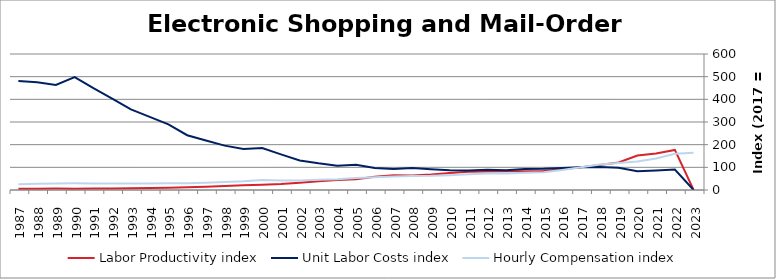
| Category | Labor Productivity index | Unit Labor Costs index | Hourly Compensation index |
|---|---|---|---|
| 2023.0 | 0 | 0 | 163.958 |
| 2022.0 | 176.887 | 90.395 | 159.896 |
| 2021.0 | 161.102 | 86.201 | 138.871 |
| 2020.0 | 152.267 | 82.836 | 126.132 |
| 2019.0 | 121.245 | 98.071 | 118.906 |
| 2018.0 | 110.797 | 101.133 | 112.052 |
| 2017.0 | 100 | 100 | 100 |
| 2016.0 | 91.362 | 96.53 | 88.192 |
| 2015.0 | 83.638 | 93.477 | 78.182 |
| 2014.0 | 82.447 | 92.845 | 76.548 |
| 2013.0 | 82.838 | 87.483 | 72.469 |
| 2012.0 | 82.098 | 89.236 | 73.261 |
| 2011.0 | 80.245 | 86.227 | 69.192 |
| 2010.0 | 74.677 | 87.289 | 65.185 |
| 2009.0 | 68.3 | 91.728 | 62.65 |
| 2008.0 | 64.123 | 96.871 | 62.117 |
| 2007.0 | 64.924 | 92.216 | 59.87 |
| 2006.0 | 58.345 | 97.13 | 56.671 |
| 2005.0 | 47.272 | 111.181 | 52.557 |
| 2004.0 | 44.415 | 107.527 | 47.758 |
| 2003.0 | 38.619 | 118.037 | 45.585 |
| 2002.0 | 32.254 | 130.573 | 42.115 |
| 2001.0 | 26.755 | 157.204 | 42.061 |
| 2000.0 | 23.591 | 185.086 | 43.663 |
| 1999.0 | 21.093 | 181.436 | 38.271 |
| 1998.0 | 17.839 | 195.837 | 34.936 |
| 1997.0 | 14.579 | 218.652 | 31.878 |
| 1996.0 | 12.378 | 241.666 | 29.913 |
| 1995.0 | 10.396 | 289.571 | 30.104 |
| 1994.0 | 8.91 | 322.891 | 28.771 |
| 1993.0 | 8.157 | 355.682 | 29.013 |
| 1992.0 | 7.021 | 403.495 | 28.328 |
| 1991.0 | 6.492 | 449.385 | 29.172 |
| 1990.0 | 5.922 | 498.081 | 29.495 |
| 1989.0 | 6.195 | 463.385 | 28.707 |
| 1988.0 | 5.814 | 474.901 | 27.61 |
| 1987.0 | 5.295 | 480.982 | 25.466 |